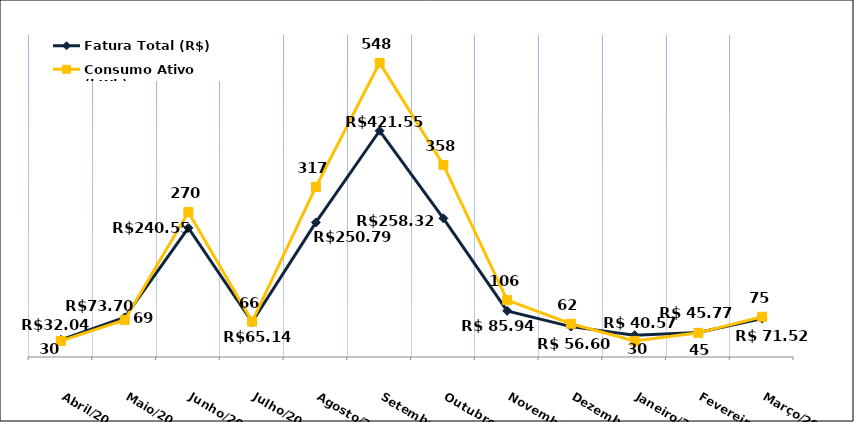
| Category | Fatura Total (R$) |
|---|---|
| Abril/2022 | 32.04 |
| Maio/2022 | 73.7 |
| Junho/2022 | 240.55 |
| Julho/2022 | 65.14 |
| Agosto/2022 | 250.79 |
| Setembro/2022 | 421.55 |
| Outubro/2022 | 258.32 |
| Novembro/2022 | 85.94 |
| Dezembro/2022 | 56.6 |
| Janeiro/2023 | 40.57 |
| Fevereiro/2023 | 45.77 |
| Março/2023 | 71.52 |